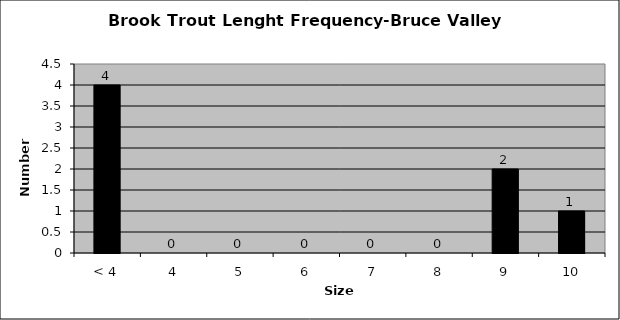
| Category | Series 0 |
|---|---|
| < 4 | 4 |
| 4 | 0 |
| 5 | 0 |
| 6 | 0 |
| 7 | 0 |
| 8 | 0 |
| 9 | 2 |
| 10 | 1 |